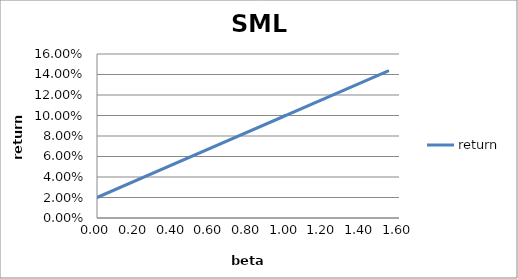
| Category | return |
|---|---|
| 0.09625611846865406 | 0.028 |
| 1.476578509587691 | 0.138 |
| 1.1774723478969535 | 0.114 |
| 0.0 | 0.02 |
| 1.0 | 0.1 |